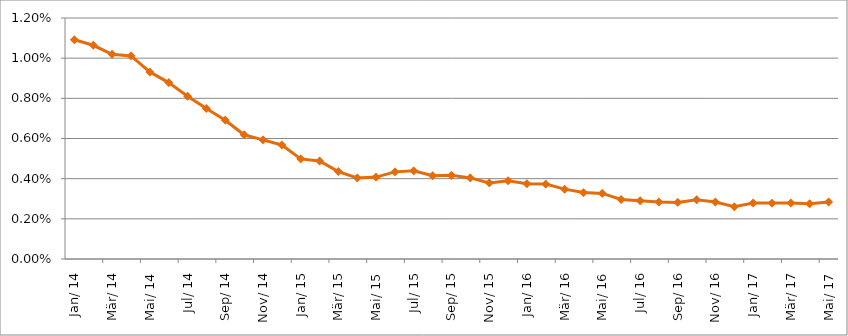
| Category | Durchschnittszins |
|---|---|
| 2014-01-01 | 0.011 |
| 2014-02-01 | 0.011 |
| 2014-03-01 | 0.01 |
| 2014-04-01 | 0.01 |
| 2014-05-01 | 0.009 |
| 2014-06-01 | 0.009 |
| 2014-07-01 | 0.008 |
| 2014-08-01 | 0.007 |
| 2014-09-01 | 0.007 |
| 2014-10-01 | 0.006 |
| 2014-11-01 | 0.006 |
| 2014-12-01 | 0.006 |
| 2015-01-01 | 0.005 |
| 2015-02-01 | 0.005 |
| 2015-03-01 | 0.004 |
| 2015-04-01 | 0.004 |
| 2015-05-01 | 0.004 |
| 2015-06-01 | 0.004 |
| 2015-07-01 | 0.004 |
| 2015-08-01 | 0.004 |
| 2015-09-01 | 0.004 |
| 2015-10-01 | 0.004 |
| 2015-11-01 | 0.004 |
| 2015-12-01 | 0.004 |
| 2016-01-01 | 0.004 |
| 2016-02-01 | 0.004 |
| 2016-03-01 | 0.003 |
| 2016-04-01 | 0.003 |
| 2016-05-01 | 0.003 |
| 2016-06-01 | 0.003 |
| 2016-07-01 | 0.003 |
| 2016-08-01 | 0.003 |
| 2016-09-01 | 0.003 |
| 2016-10-01 | 0.003 |
| 2016-11-01 | 0.003 |
| 2016-12-01 | 0.003 |
| 2017-01-01 | 0.003 |
| 2017-02-01 | 0.003 |
| 2017-03-01 | 0.003 |
| 2017-04-01 | 0.003 |
| 2017-05-01 | 0.003 |